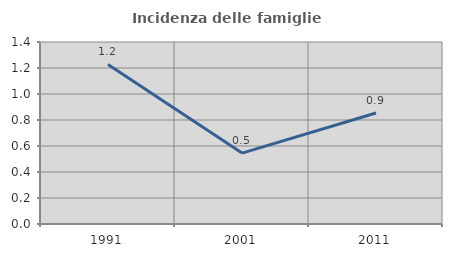
| Category | Incidenza delle famiglie numerose |
|---|---|
| 1991.0 | 1.227 |
| 2001.0 | 0.545 |
| 2011.0 | 0.854 |